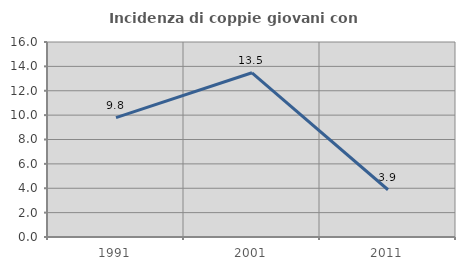
| Category | Incidenza di coppie giovani con figli |
|---|---|
| 1991.0 | 9.79 |
| 2001.0 | 13.475 |
| 2011.0 | 3.876 |